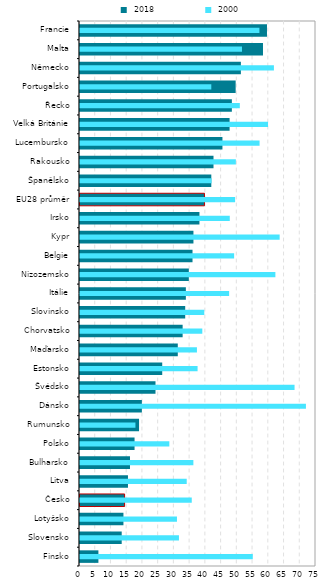
| Category |  2018 |
|---|---|
| Finsko | 5.849 |
| Slovensko | 13.253 |
| Lotyšsko | 13.804 |
| Česko | 14.176 |
| Litva | 15.245 |
| Bulharsko | 15.888 |
| Polsko | 17.339 |
| Rumunsko | 18.763 |
| Dánsko | 19.663 |
| Švédsko | 23.992 |
| Estonsko | 26.131 |
| Maďarsko | 31.078 |
| Chorvatsko | 32.616 |
| Slovinsko | 33.434 |
| Itálie | 33.643 |
| Nizozemsko | 34.585 |
| Belgie | 35.756 |
| Kypr | 36.052 |
| Irsko | 37.96 |
| EU28 průměr | 39.547 |
| Španělsko | 41.729 |
| Rakousko | 42.428 |
| Lucembursko | 45.268 |
| Velká Británie | 47.541 |
| Řecko | 48.26 |
| Portugalsko | 49.467 |
| Německo | 51.128 |
| Malta | 58.153 |
| Francie | 59.424 |